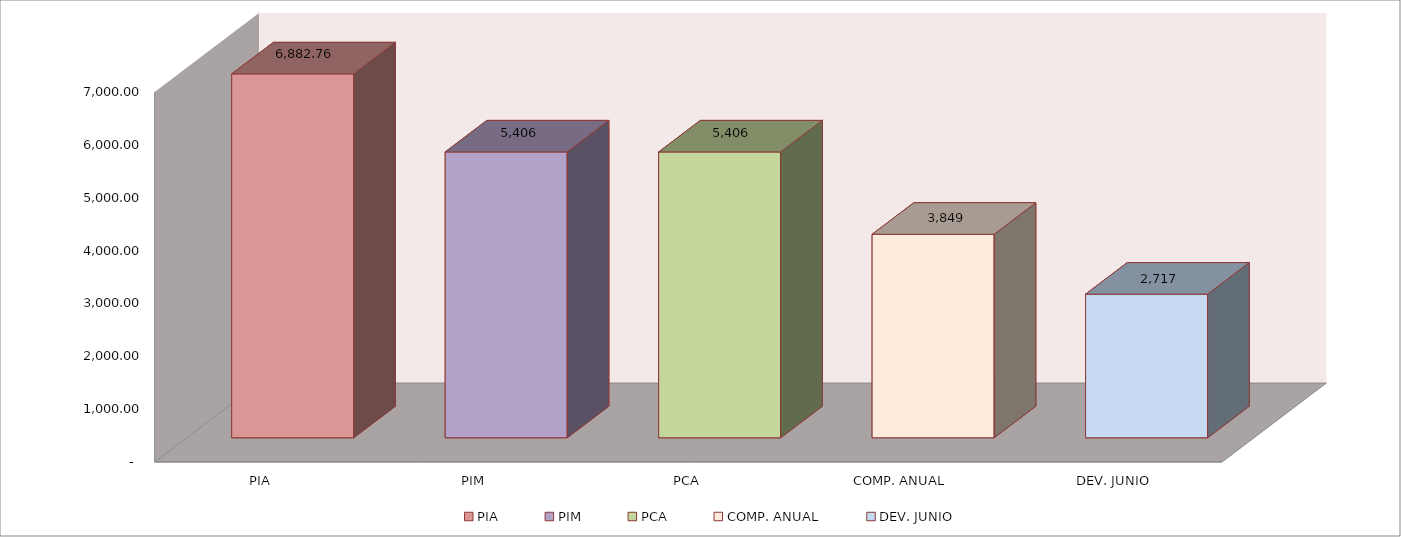
| Category | 011 MINISTERIO DE SALUD |
|---|---|
| PIA | 6882.759 |
| PIM | 5406.365 |
| PCA | 5406.365 |
| COMP. ANUAL | 3849.363 |
| DEV. JUNIO | 2716.79 |